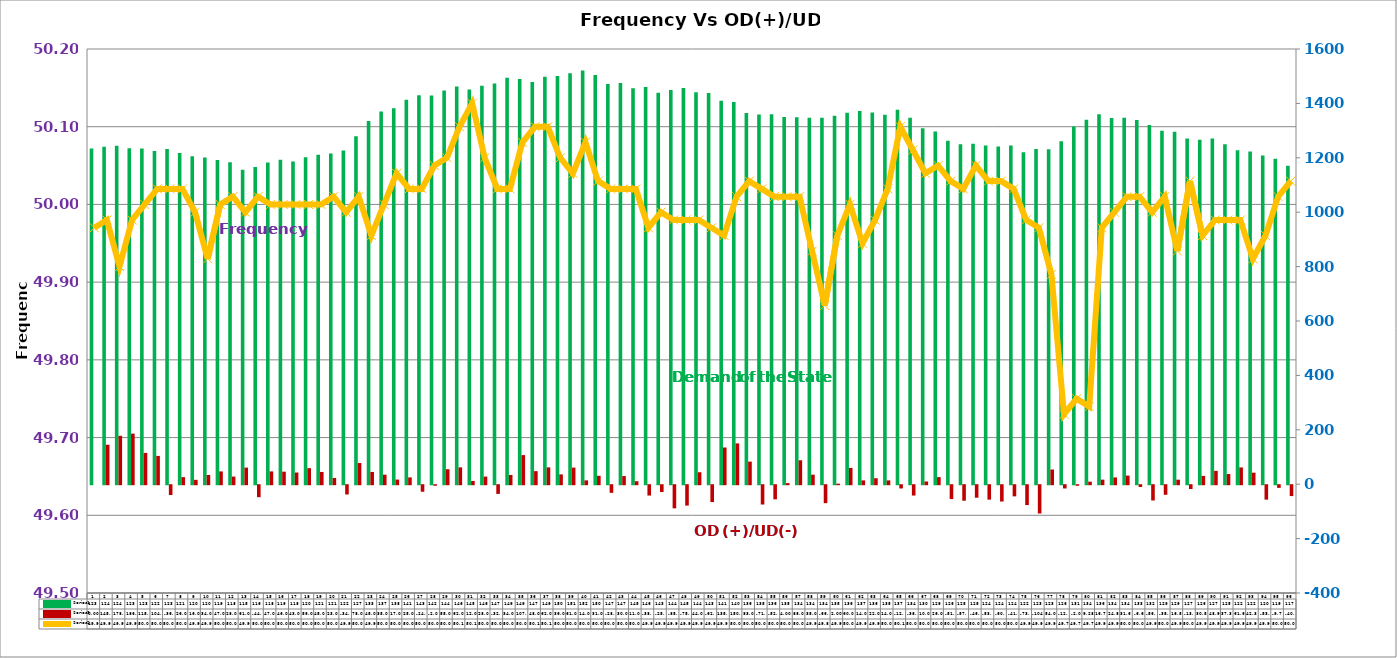
| Category | Series 2 | Series 4 |
|---|---|---|
| 0 | 1234 | 0 |
| 1 | 1241 | 145 |
| 2 | 1244 | 178 |
| 3 | 1235 | 186 |
| 4 | 1234 | 115 |
| 5 | 1225 | 104 |
| 6 | 1232 | -36 |
| 7 | 1218 | 26 |
| 8 | 1206 | 16 |
| 9 | 1201 | 34 |
| 10 | 1192 | 47 |
| 11 | 1184 | 28 |
| 12 | 1156 | 61 |
| 13 | 1166 | -44 |
| 14 | 1183 | 47 |
| 15 | 1193 | 46 |
| 16 | 1186 | 43 |
| 17 | 1202 | 59 |
| 18 | 1211 | 45 |
| 19 | 1216 | 23 |
| 20 | 1227 | -34 |
| 21 | 1279 | 78 |
| 22 | 1335 | 45 |
| 23 | 1370 | 35 |
| 24 | 1382 | 17 |
| 25 | 1413 | 25 |
| 26 | 1430 | -24 |
| 27 | 1429 | -2 |
| 28 | 1447 | 55 |
| 29 | 1462 | 62 |
| 30 | 1451 | 12 |
| 31 | 1465 | 28 |
| 32 | 1473 | -32 |
| 33 | 1494 | 34 |
| 34 | 1490 | 107 |
| 35 | 1479 | 48 |
| 36 | 1498 | 62 |
| 37 | 1501 | 36 |
| 38 | 1511 | 61 |
| 39 | 1521 | 14 |
| 40 | 1504 | 31 |
| 41 | 1471 | -28 |
| 42 | 1475 | 30 |
| 43 | 1456 | 11 |
| 44 | 1460 | -38 |
| 45 | 1439 | -25 |
| 46 | 1449 | -85 |
| 47 | 1457 | -75 |
| 48 | 1441 | 44 |
| 49 | 1438 | -62 |
| 50 | 1410 | 135 |
| 51 | 1405 | 150 |
| 52 | 1365 | 83 |
| 53 | 1359 | -71 |
| 54 | 1360 | -52 |
| 55 | 1350 | 4 |
| 56 | 1349 | 88 |
| 57 | 1347 | 35 |
| 58 | 1347 | -66 |
| 59 | 1355 | 2 |
| 60 | 1366 | 60 |
| 61 | 1372 | 14 |
| 62 | 1367 | 22 |
| 63 | 1358 | 14 |
| 64 | 1377 | -12 |
| 65 | 1347 | -38 |
| 66 | 1309 | 10 |
| 67 | 1297 | 26 |
| 68 | 1263 | -51 |
| 69 | 1250 | -57 |
| 70 | 1252 | -46 |
| 71 | 1245 | -53 |
| 72 | 1242 | -60 |
| 73 | 1245 | -41 |
| 74 | 1220 | -73 |
| 75 | 1232 | -104 |
| 76 | 1231 | 54 |
| 77 | 1261 | -12 |
| 78 | 1315 | -2 |
| 79 | 1340.33 | 9.28 |
| 80 | 1360.32 | 16.75 |
| 81 | 1345.92 | 24.88 |
| 82 | 1347.01 | 31.65 |
| 83 | 1339.41 | -6.63 |
| 84 | 1320.2 | -56.2 |
| 85 | 1299.11 | -35.24 |
| 86 | 1295.42 | 16.56 |
| 87 | 1270.91 | -13.98 |
| 88 | 1266.17 | 30.51 |
| 89 | 1270.53 | 48.99 |
| 90 | 1249.79 | 37.3 |
| 91 | 1227.52 | 61.62 |
| 92 | 1223.29 | 42.3 |
| 93 | 1208.76 | -53.08 |
| 94 | 1196.93 | -9.79 |
| 95 | 1171 | -40 |